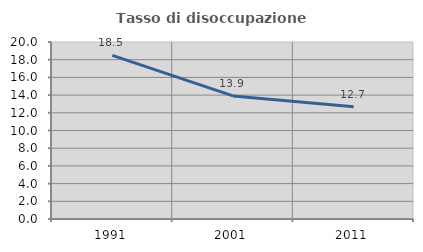
| Category | Tasso di disoccupazione giovanile  |
|---|---|
| 1991.0 | 18.491 |
| 2001.0 | 13.907 |
| 2011.0 | 12.687 |